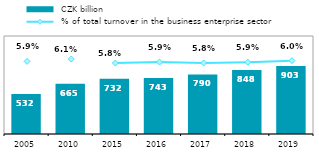
| Category |  CZK billion |
|---|---|
| 2005.0 | 531.811 |
| 2010.0 | 665.424 |
| 2015.0 | 731.591 |
| 2016.0 | 742.844 |
| 2017.0 | 789.99 |
| 2018.0 | 847.611 |
| 2019.0 | 903.369 |